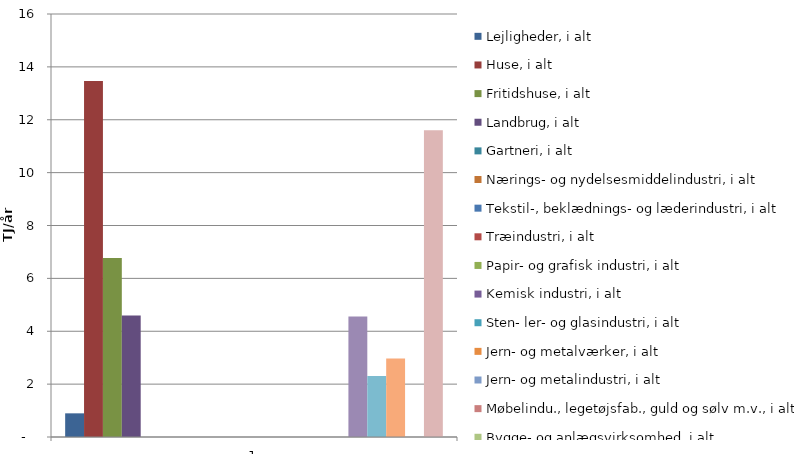
| Category | Lejligheder, i alt | Huse, i alt | Fritidshuse, i alt | Landbrug, i alt | Gartneri, i alt | Nærings- og nydelsesmiddelindustri, i alt | Tekstil-, beklædnings- og læderindustri, i alt | Træindustri, i alt | Papir- og grafisk industri, i alt | Kemisk industri, i alt | Sten- ler- og glasindustri, i alt | Jern- og metalværker, i alt | Jern- og metalindustri, i alt | Møbelindu., legetøjsfab., guld og sølv m.v., i alt | Bygge- og anlægsvirksomhed, i alt | Detail- og engroshandel, i alt | Service- og forlystelsesvirksomhed, i alt | Offentlige foretageneder, i alt | Gade- og vejbelysning, i alt | Anonymiseret og/eller ukendt |
|---|---|---|---|---|---|---|---|---|---|---|---|---|---|---|---|---|---|---|---|---|
| 0 | 0.895 | 13.464 | 6.768 | 4.598 | 0 | 0 | 0 | 0 | 0 | 0 | 0 | 0 | 0 | 0 | 0 | 4.556 | 2.31 | 2.971 | 0 | 11.605 |